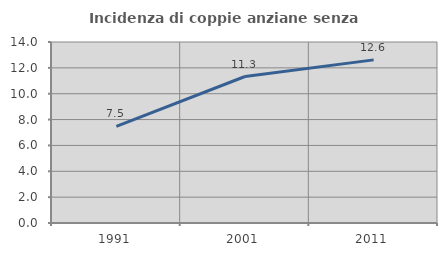
| Category | Incidenza di coppie anziane senza figli  |
|---|---|
| 1991.0 | 7.471 |
| 2001.0 | 11.33 |
| 2011.0 | 12.617 |